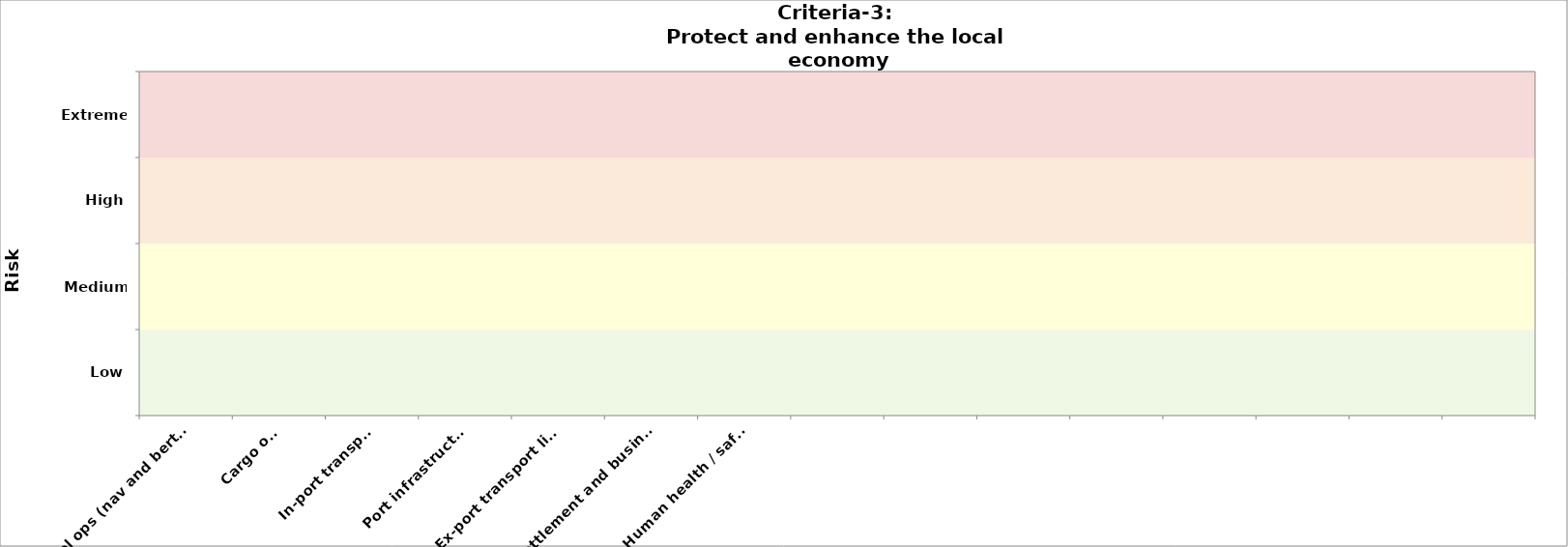
| Category | Criteria-3 (public health) | Criteria-3 
2050 |
|---|---|---|
| Vessel ops (nav and berthing) |  | 0 |
| Cargo ops |  | 0 |
| In-port transport |  | 0 |
| Port infrastructure |  | 0 |
| Ex-port transport links |  | 0 |
| Ex-port settlement and businesses |  | 0 |
| Human health / safety  |  | 0 |